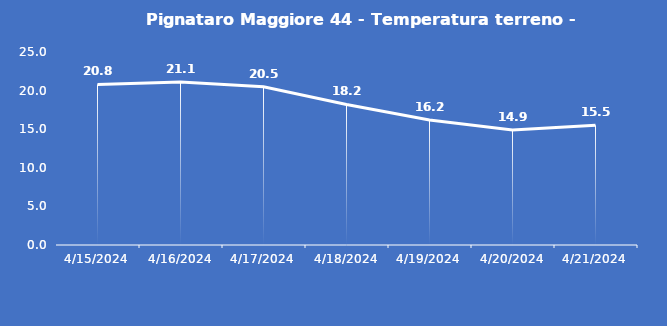
| Category | Pignataro Maggiore 44 - Temperatura terreno - Grezzo (°C) |
|---|---|
| 4/15/24 | 20.8 |
| 4/16/24 | 21.1 |
| 4/17/24 | 20.5 |
| 4/18/24 | 18.2 |
| 4/19/24 | 16.2 |
| 4/20/24 | 14.9 |
| 4/21/24 | 15.5 |